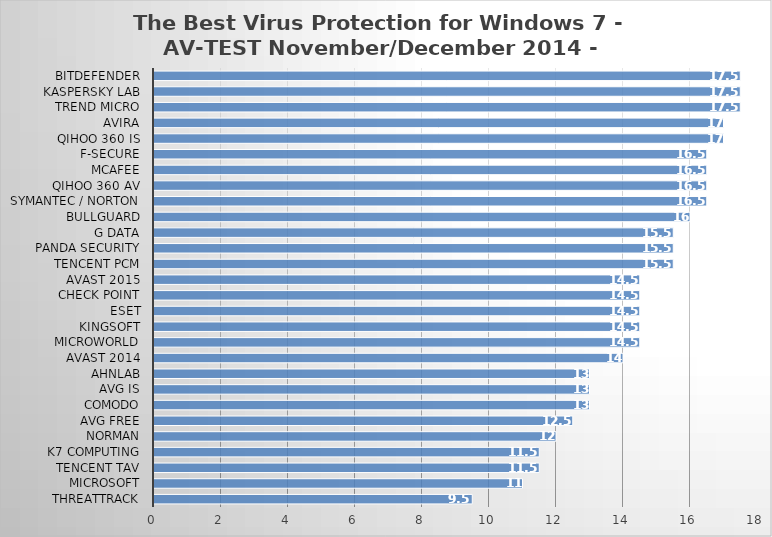
| Category | Series 0 |
|---|---|
| ThreatTrack | 9.5 |
| Microsoft | 11 |
| Tencent TAV | 11.5 |
| K7 Computing | 11.5 |
| Norman | 12 |
| AVG Free | 12.5 |
| Comodo | 13 |
| AVG IS | 13 |
| AhnLab | 13 |
| Avast 2014 | 14 |
| Microworld | 14.5 |
| Kingsoft | 14.5 |
| ESET | 14.5 |
| Check Point | 14.5 |
| Avast 2015 | 14.5 |
| Tencent PCM | 15.5 |
| Panda Security | 15.5 |
| G Data | 15.5 |
| BullGuard | 16 |
| Symantec / Norton | 16.5 |
| Qihoo 360 AV | 16.5 |
| McAfee | 16.5 |
| F-Secure | 16.5 |
| Qihoo 360 IS | 17 |
| Avira | 17 |
| Trend Micro | 17.5 |
| Kaspersky Lab | 17.5 |
| Bitdefender | 17.5 |